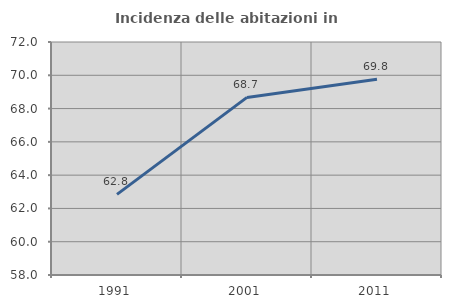
| Category | Incidenza delle abitazioni in proprietà  |
|---|---|
| 1991.0 | 62.845 |
| 2001.0 | 68.672 |
| 2011.0 | 69.768 |